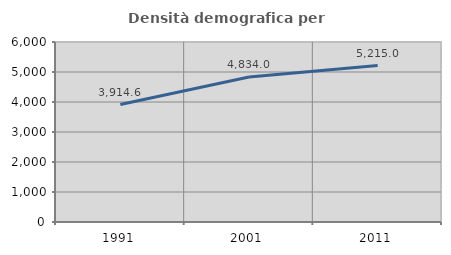
| Category | Densità demografica |
|---|---|
| 1991.0 | 3914.588 |
| 2001.0 | 4833.965 |
| 2011.0 | 5214.977 |